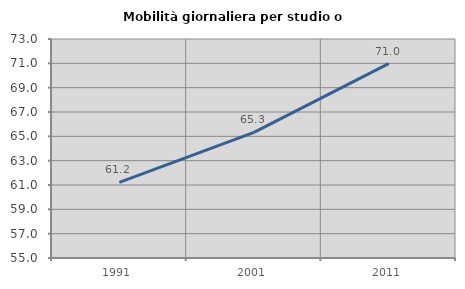
| Category | Mobilità giornaliera per studio o lavoro |
|---|---|
| 1991.0 | 61.21 |
| 2001.0 | 65.331 |
| 2011.0 | 70.977 |